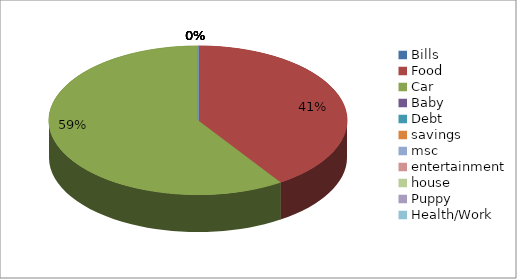
| Category | Series 0 |
|---|---|
| Bills | 0 |
| Food | 23.99 |
| Car | 35 |
| Baby  | 0 |
| Debt | 0 |
| savings | 0 |
| msc | 0 |
| entertainment | 0 |
| house | 0 |
| Puppy | 0 |
| Health/Work | 0 |